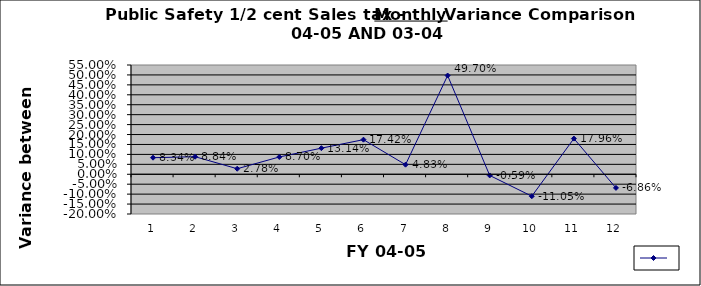
| Category | Series 0 |
|---|---|
| 0 | 0.083 |
| 1 | 0.088 |
| 2 | 0.028 |
| 3 | 0.087 |
| 4 | 0.131 |
| 5 | 0.174 |
| 6 | 0.048 |
| 7 | 0.497 |
| 8 | -0.006 |
| 9 | -0.11 |
| 10 | 0.18 |
| 11 | -0.069 |